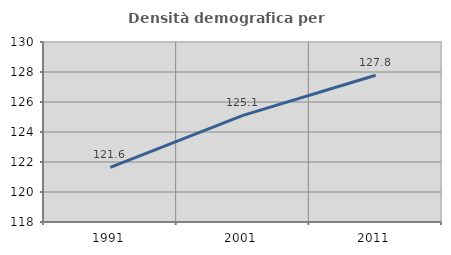
| Category | Densità demografica |
|---|---|
| 1991.0 | 121.641 |
| 2001.0 | 125.11 |
| 2011.0 | 127.787 |